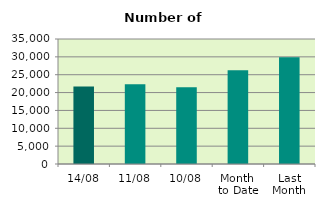
| Category | Series 0 |
|---|---|
| 14/08 | 21728 |
| 11/08 | 22354 |
| 10/08 | 21508 |
| Month 
to Date | 26223.2 |
| Last
Month | 29864.476 |